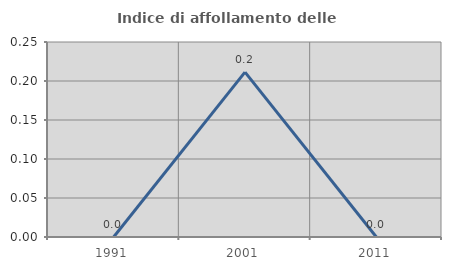
| Category | Indice di affollamento delle abitazioni  |
|---|---|
| 1991.0 | 0 |
| 2001.0 | 0.211 |
| 2011.0 | 0 |